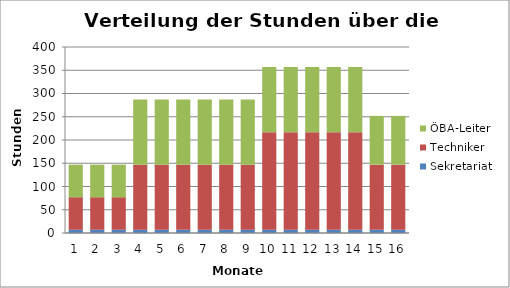
| Category | Sekretariat | Techniker | ÖBA-Leiter |
|---|---|---|---|
| 0 | 6.996 | 69.962 | 69.962 |
| 1 | 6.996 | 69.962 | 69.962 |
| 2 | 6.996 | 69.962 | 69.962 |
| 3 | 6.996 | 139.925 | 139.925 |
| 4 | 6.996 | 139.925 | 139.925 |
| 5 | 6.996 | 139.925 | 139.925 |
| 6 | 6.996 | 139.925 | 139.925 |
| 7 | 6.996 | 139.925 | 139.925 |
| 8 | 6.996 | 139.925 | 139.925 |
| 9 | 6.996 | 209.888 | 139.925 |
| 10 | 6.996 | 209.888 | 139.925 |
| 11 | 6.996 | 209.888 | 139.925 |
| 12 | 6.996 | 209.888 | 139.925 |
| 13 | 6.996 | 209.888 | 139.925 |
| 14 | 6.996 | 139.925 | 104.944 |
| 15 | 6.996 | 139.925 | 104.944 |